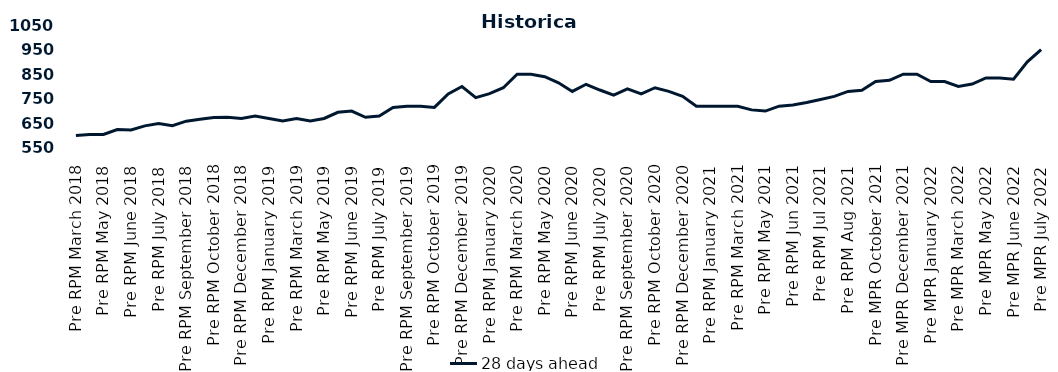
| Category | 28 days ahead |
|---|---|
| Pre RPM March 2018 | 601 |
| Post RPM March 2018 | 605 |
| Pre RPM May 2018 | 605 |
| Post RPM May 2018 | 625 |
| Pre RPM June 2018 | 623 |
| Post RPM June 2018 | 640 |
| Pre RPM July 2018 | 650 |
| Post RPM July 2018 | 641 |
| Pre RPM September 2018 | 659 |
| Post RPM September 2018 | 666.75 |
| Pre RPM October 2018 | 674 |
| Post RPM October 2018 | 675 |
| Pre RPM December 2018 | 670 |
| Post RPM December 2018 | 680 |
| Pre RPM January 2019 | 670 |
| Post RPM January 2019 | 660 |
| Pre RPM March 2019 | 670 |
| Post RPM March 2019 | 660 |
| Pre RPM May 2019 | 670 |
| Post RPM May 2019 | 695 |
| Pre RPM June 2019 | 700 |
| Post RPM June 2019 | 675 |
| Pre RPM July 2019 | 680 |
| Post RPM July 2019 | 715 |
| Pre RPM September 2019 | 720 |
| Post RPM September 2019 | 720 |
| Pre RPM October 2019 | 715 |
| Post RPM October 2019 | 770 |
| Pre RPM December 2019 | 800 |
| Post RPM December 2019 | 755 |
| Pre RPM January 2020 | 771 |
| Post RPM January 2020 | 795 |
| Pre RPM March 2020 | 850 |
| Post RPM March 2020 | 850 |
| Pre RPM May 2020 | 840 |
| Post RPM May 2020 | 815 |
| Pre RPM June 2020 | 780 |
| Post RPM June 2020 | 809 |
| Pre RPM July 2020 | 785.72 |
| Post RPM July 2020 | 765 |
| Pre RPM September 2020 | 790 |
| Post RPM September 2020 | 770 |
| Pre RPM October 2020 | 795 |
| Post RPM October 2020 | 780 |
| Pre RPM December 2020 | 760 |
|  Post RPM December 2020 | 720 |
| Pre RPM January 2021 | 720 |
| Post RPM January 2021 | 720 |
|  Pre RPM March 2021 | 720 |
|  Post RPM March 2021 | 705 |
|  Pre RPM May 2021 | 700 |
|  Post RPM May 2021 | 720 |
|  Pre RPM Jun 2021 | 725 |
|   Post RPM Jun 2021 | 735 |
| Pre RPM Jul 2021 | 747.5 |
|  Post RPM Jul 2021 | 760 |
| Pre RPM Aug 2021 | 780 |
|  Post RPM Aug 2021 | 785 |
| Pre MPR October 2021 | 820 |
| Post MPR October 2021 | 825 |
| Pre MPR December 2021 | 850 |
| Post MPR December 2021 | 850 |
| Pre MPR January 2022 | 820 |
| Post MPR January 2022 | 820 |
| Pre MPR March 2022 | 800 |
| Post MPR March 2022 | 810 |
| Pre MPR May 2022 | 835 |
| Post MPR May 2022 | 835 |
| Pre MPR June 2022 | 830 |
| Post MPR June 2022 | 900 |
| Pre MPR July 2022 | 950 |